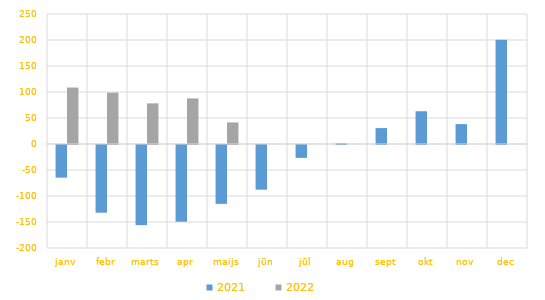
| Category | 2021 | 2022 |
|---|---|---|
| janv | -62808.075 | 108554.179 |
| febr | -130183.513 | 98735.641 |
| marts | -154114.179 | 78145.563 |
| apr | -147503.301 | 87696.664 |
| maijs | -113180.114 | 41467.941 |
| jūn | -85892.075 | 0 |
| jūl | -24790.077 | 0 |
| aug | 1407.353 | 0 |
| sept | 30609.788 | 0 |
| okt | 63006.825 | 0 |
| nov | 38267.962 | 0 |
| dec | 200524.486 | 0 |